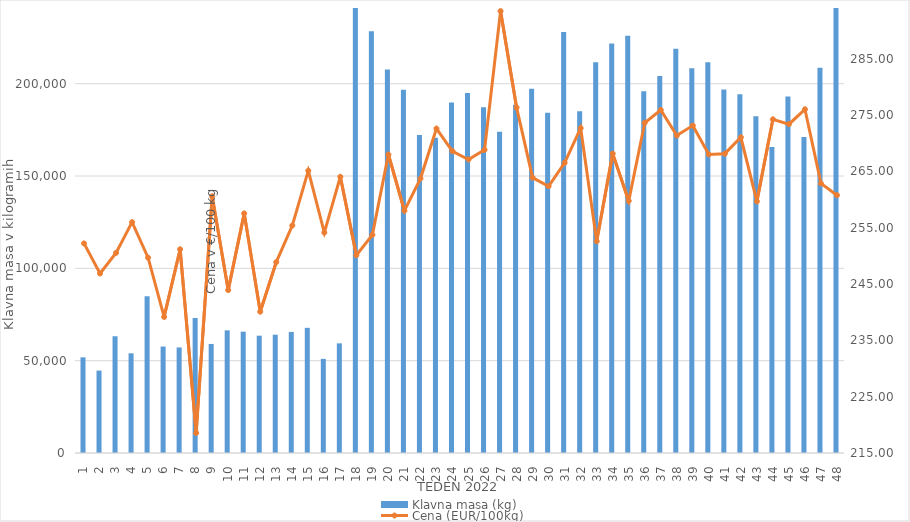
| Category | Klavna masa (kg) |
|---|---|
| 1.0 | 51818 |
| 2.0 | 44619 |
| 3.0 | 63233 |
| 4.0 | 53993 |
| 5.0 | 84871 |
| 6.0 | 57648 |
| 7.0 | 57159 |
| 8.0 | 73139 |
| 9.0 | 59056 |
| 10.0 | 66417 |
| 11.0 | 65723 |
| 12.0 | 63530 |
| 13.0 | 64069 |
| 14.0 | 65564 |
| 15.0 | 67787 |
| 16.0 | 50958 |
| 17.0 | 59387 |
| 18.0 | 241833 |
| 19.0 | 228389 |
| 20.0 | 207661 |
| 21.0 | 196732 |
| 22.0 | 172190 |
| 23.0 | 170751 |
| 24.0 | 189775 |
| 25.0 | 195029 |
| 26.0 | 187239 |
| 27.0 | 173967 |
| 28.0 | 188601 |
| 29.0 | 197293 |
| 30.0 | 184259 |
| 31.0 | 228023 |
| 32.0 | 185079 |
| 33.0 | 211612 |
| 34.0 | 221748 |
| 35.0 | 225927 |
| 36.0 | 195924 |
| 37.0 | 204224 |
| 38.0 | 218966 |
| 39.0 | 208403 |
| 40.0 | 211635 |
| 41.0 | 196841 |
| 42.0 | 194271 |
| 43.0 | 182399 |
| 44.0 | 165696 |
| 45.0 | 193022 |
| 46.0 | 171172 |
| 47.0 | 208597 |
| 48.0 | 253151 |